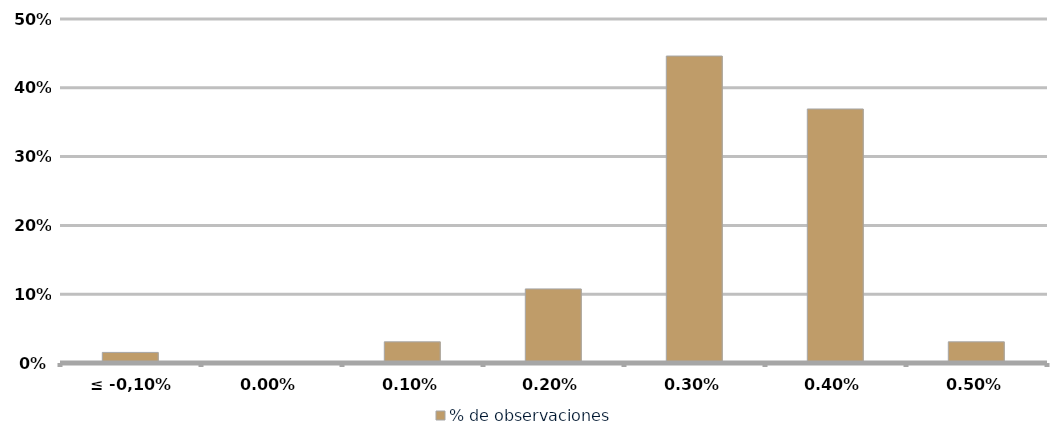
| Category | % de observaciones  |
|---|---|
| ≤ -0,10% | 0.015 |
| 0,00% | 0 |
| 0,10% | 0.031 |
| 0,20% | 0.108 |
| 0,30% | 0.446 |
| 0,40% | 0.369 |
| 0,50% | 0.031 |